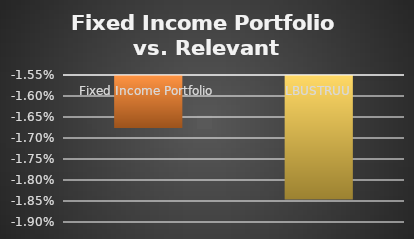
| Category | Series 0 |
|---|---|
| Fixed Income Portfolio | -0.017 |
| LBUSTRUU | -0.018 |